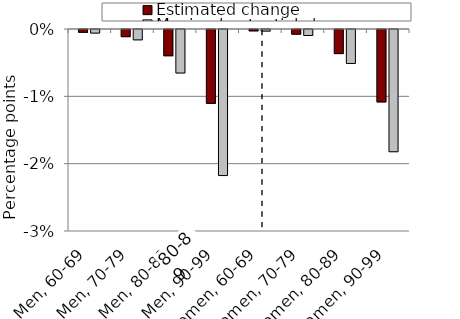
| Category | Estimated change | Maximal potential change |
|---|---|---|
| Men, 60-69 | 0 | -0.001 |
| Men, 70-79 | -0.001 | -0.002 |
| Men, 80-89 | -0.004 | -0.006 |
| Men, 90-99 | -0.011 | -0.022 |
| Women, 60-69 | 0 | 0 |
| Women, 70-79 | -0.001 | -0.001 |
| Women, 80-89 | -0.004 | -0.005 |
| Women, 90-99 | -0.011 | -0.018 |